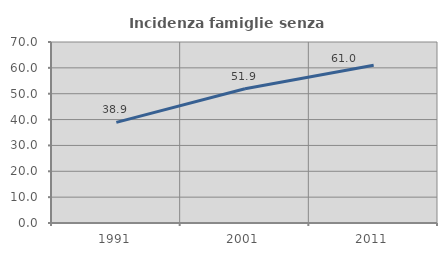
| Category | Incidenza famiglie senza nuclei |
|---|---|
| 1991.0 | 38.927 |
| 2001.0 | 51.899 |
| 2011.0 | 60.99 |